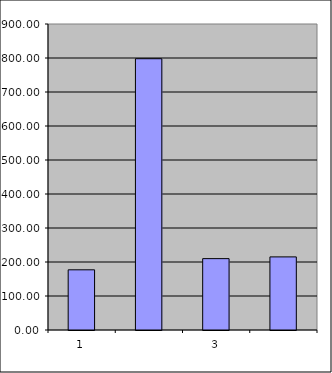
| Category | Series 0 |
|---|---|
| 0 | 177 |
| 1 | 797.903 |
| 2 | 209.883 |
| 3 | 214.995 |